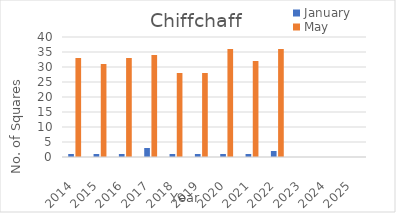
| Category | January | May |
|---|---|---|
| 2014.0 | 1 | 33 |
| 2015.0 | 1 | 31 |
| 2016.0 | 1 | 33 |
| 2017.0 | 3 | 34 |
| 2018.0 | 1 | 28 |
| 2019.0 | 1 | 28 |
| 2020.0 | 1 | 36 |
| 2021.0 | 1 | 32 |
| 2022.0 | 2 | 36 |
| 2023.0 | 0 | 0 |
| 2024.0 | 0 | 0 |
| 2025.0 | 0 | 0 |